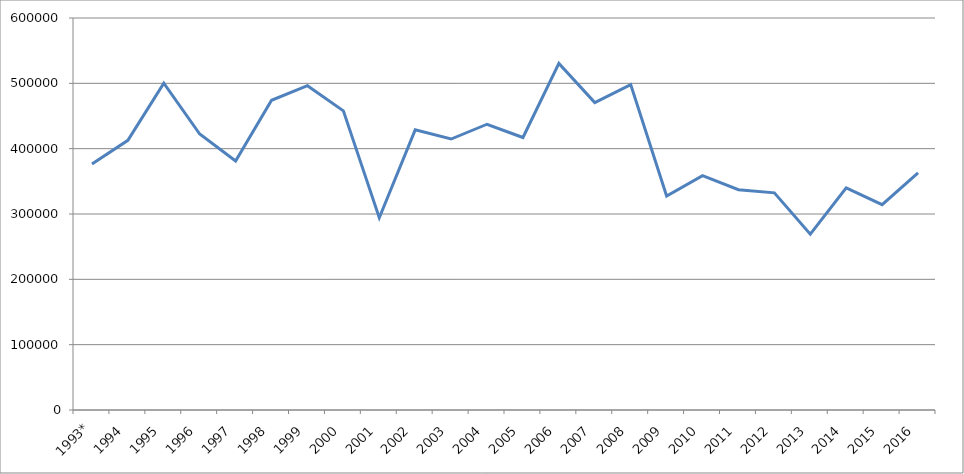
| Category | Series 0 |
|---|---|
| 1993* | 376591 |
| 1994 | 412687 |
| 1995 | 500249 |
| 1996 | 422419 |
| 1997 | 381219 |
| 1998 | 474093 |
| 1999 | 496338 |
| 2000 | 457851.5 |
| 2001 | 294318 |
| 2002 | 428754.1 |
| 2003 | 414757.06 |
| 2004 | 437391.2 |
| 2005 | 417071.5 |
| 2006 | 530513.26 |
| 2007 | 470583.8 |
| 2008 | 497982.36 |
| 2009 | 327569.2 |
| 2010 | 358682.8 |
| 2011 | 337119.52 |
| 2012 | 332357.91 |
| 2013 | 269156.5 |
| 2014 | 340077.18 |
| 2015 | 314388.2 |
| 2016 | 362945.78 |